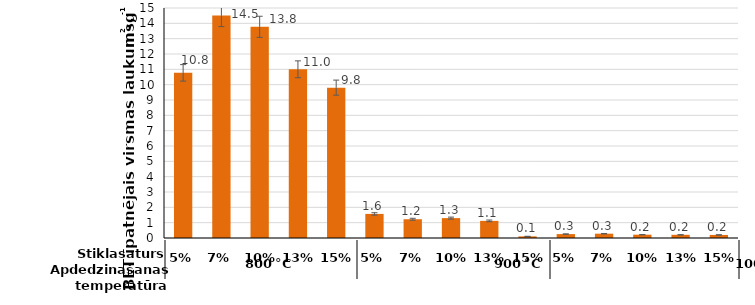
| Category | Series 0 |
|---|---|
| 5% | 10.77 |
| 7% | 14.51 |
| 10% | 13.773 |
| 13% | 11.002 |
| 15% | 9.807 |
| 5% | 1.571 |
| 7% | 1.224 |
| 10% | 1.297 |
| 13% | 1.117 |
| 15% | 0.105 |
| 5% | 0.256 |
| 7% | 0.281 |
| 10% | 0.216 |
| 13% | 0.207 |
| 15% | 0.2 |